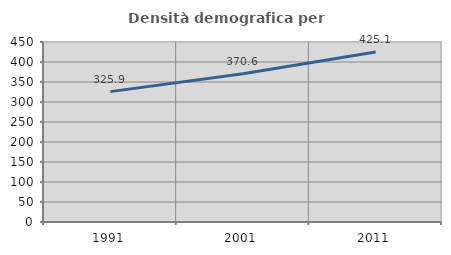
| Category | Densità demografica |
|---|---|
| 1991.0 | 325.93 |
| 2001.0 | 370.637 |
| 2011.0 | 425.119 |